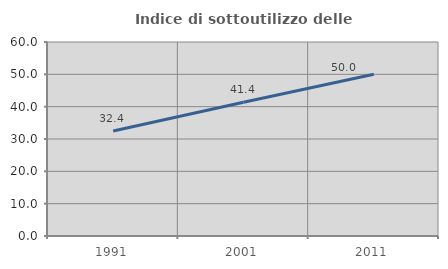
| Category | Indice di sottoutilizzo delle abitazioni  |
|---|---|
| 1991.0 | 32.448 |
| 2001.0 | 41.351 |
| 2011.0 | 50 |